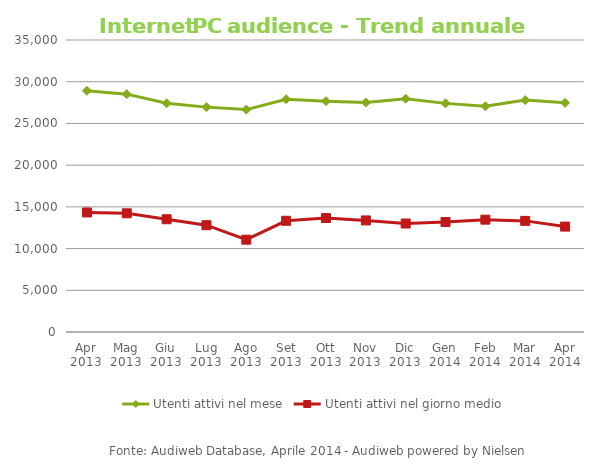
| Category | Utenti attivi nel mese | Utenti attivi nel giorno medio |
|---|---|---|
| Apr 2013 | 28913 | 14328 |
| Mag 2013 | 28509 | 14227 |
| Giu 2013 | 27414 | 13515 |
| Lug 2013 | 26954 | 12801 |
| Ago 2013 | 26658 | 11065 |
| Set 2013 | 27902 | 13330 |
| Ott 2013 | 27666 | 13657 |
| Nov 2013 | 27513 | 13375 |
| Dic 2013 | 27963 | 13003 |
| Gen 2014 | 27404 | 13180 |
| Feb 2014 | 27051 | 13466 |
| Mar 2014 | 27796 | 13318 |
| Apr 2014 | 27468 | 12634 |